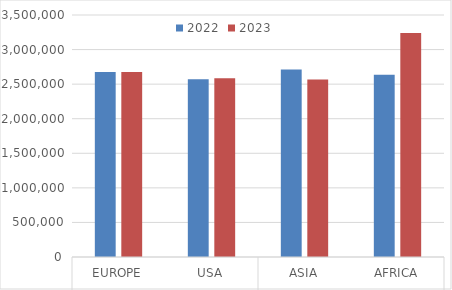
| Category | 2022 | 2023 |
|---|---|---|
| 0 | 2675496 | 2674096 |
| 1 | 2569892 | 2584865 |
| 2 | 2711156 | 2566978 |
| 3 | 2635979 | 3240921 |